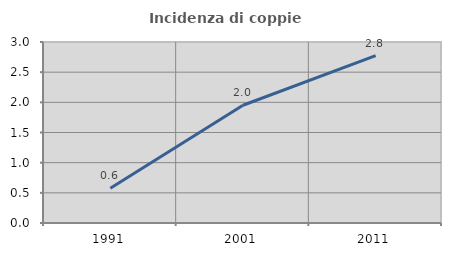
| Category | Incidenza di coppie miste |
|---|---|
| 1991.0 | 0.575 |
| 2001.0 | 1.952 |
| 2011.0 | 2.776 |